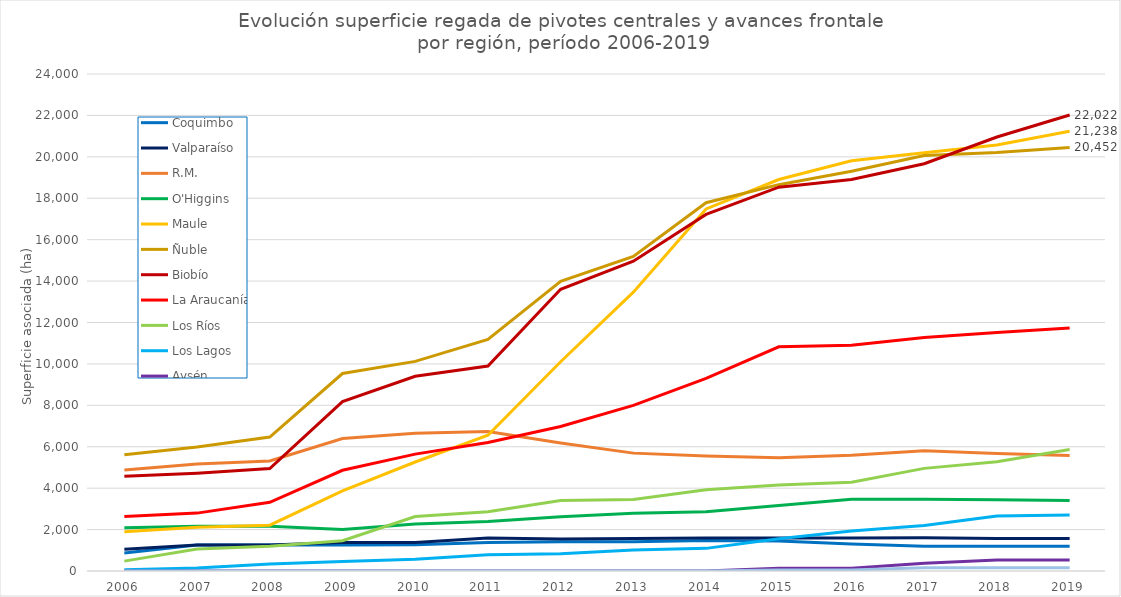
| Category | Coquimbo | Valparaíso | R.M. | O'Higgins | Maule | Ñuble | Biobío | La Araucanía | Los Ríos | Los Lagos | Aysén | Magallanes |
|---|---|---|---|---|---|---|---|---|---|---|---|---|
| 2006.0 | 874 | 1045 | 4882 | 2090 | 1898 | 5618 | 4571 | 2635 | 476 | 55 | 0 | 0 |
| 2007.0 | 1258 | 1253 | 5163 | 2161 | 2109 | 5984 | 4725 | 2795 | 1059 | 140 | 0 | 0 |
| 2008.0 | 1258 | 1253 | 5317 | 2161 | 2214 | 6466 | 4949 | 3318 | 1195 | 342 | 0 | 0 |
| 2009.0 | 1258 | 1378 | 6395 | 2005 | 3866 | 9536 | 8179 | 4863 | 1465 | 456 | 0 | 0 |
| 2010.0 | 1273 | 1378 | 6646 | 2269 | 5264 | 10122 | 9406 | 5643 | 2631 | 573 | 0 | 0 |
| 2011.0 | 1375 | 1589 | 6733 | 2388 | 6556 | 11181 | 9899 | 6207 | 2866 | 780 | 0 | 0 |
| 2012.0 | 1411 | 1548 | 6180 | 2616 | 10107 | 13988 | 13604 | 6980 | 3400 | 828 | 0 | 0 |
| 2013.0 | 1411 | 1568 | 5692 | 2789 | 13465 | 15195 | 14961 | 7997 | 3450 | 1010 | 0 | 0 |
| 2014.0 | 1472 | 1596 | 5553 | 2865 | 17485 | 17783 | 17218 | 9300 | 3920 | 1093 | 0 | 0 |
| 2015.0 | 1451 | 1596 | 5466 | 3158 | 18904 | 18656 | 18535 | 10825 | 4149 | 1554 | 128 | 51 |
| 2016.0 | 1303 | 1596 | 5584 | 3461 | 19812 | 19308 | 18908 | 10898 | 4289 | 1930 | 128 | 51 |
| 2017.0 | 1201 | 1606 | 5803 | 3463 | 20194 | 20065 | 19666 | 11275 | 4956 | 2198 | 380 | 153 |
| 2018.0 | 1201 | 1567 | 5674 | 3439 | 20575 | 20206 | 20956 | 11514 | 5275 | 2650 | 531 | 153 |
| 2019.0 | 1201 | 1567 | 5582 | 3408 | 21238 | 20452 | 22022 | 11740 | 5870 | 2710 | 531 | 153 |